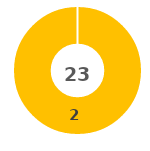
| Category | Series 0 |
|---|---|
| 0 | 0 |
| 1 | 0 |
| 2 | 2 |
| 3 | 0 |
| 4 | 0 |